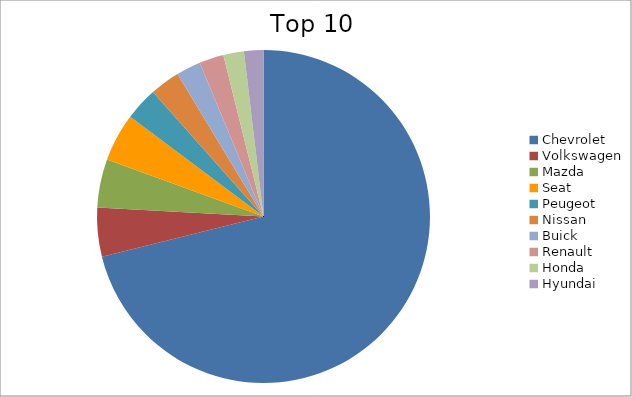
| Category | Series 0 |
|---|---|
| Chevrolet | 71.13 |
| Volkswagen | 4.73 |
| Mazda | 4.7 |
| Seat | 4.67 |
| Peugeot | 3.22 |
| Nissan | 2.92 |
| Buick | 2.39 |
| Renault | 2.37 |
| Honda | 2 |
| Hyundai | 1.88 |